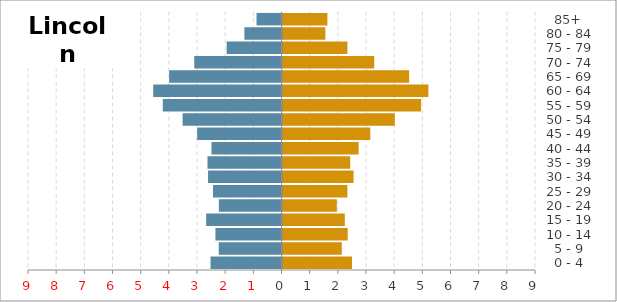
| Category | Female | Male |
|---|---|---|
|   0 - 4 | 2.466 | -2.519 |
|   5 - 9 | 2.106 | -2.228 |
| 10 - 14 | 2.315 | -2.346 |
| 15 - 19 | 2.212 | -2.676 |
| 20 - 24 | 1.929 | -2.224 |
| 25 - 29 | 2.304 | -2.432 |
| 30 - 34 | 2.523 | -2.608 |
| 35 - 39 | 2.404 | -2.627 |
| 40 - 44 | 2.704 | -2.487 |
| 45 - 49 | 3.117 | -2.995 |
| 50 - 54 | 3.988 | -3.511 |
| 55 - 59 | 4.921 | -4.215 |
| 60 - 64 | 5.179 | -4.554 |
| 65 - 69 | 4.496 | -3.989 |
| 70 - 74 | 3.256 | -3.098 |
| 75 - 79 | 2.306 | -1.947 |
| 80 - 84 | 1.521 | -1.318 |
|   85+ | 1.594 | -0.887 |